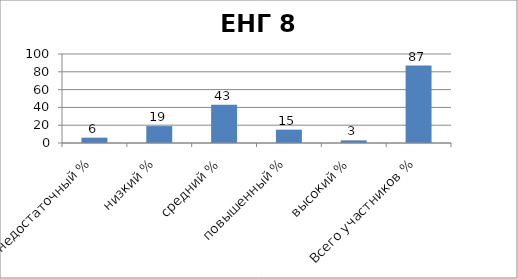
| Category | Series 0 |
|---|---|
| недостаточный % | 6 |
| низкий % | 19 |
| средний % | 43 |
| повышенный % | 15 |
| высокий % | 3 |
| Всего участников % | 87 |